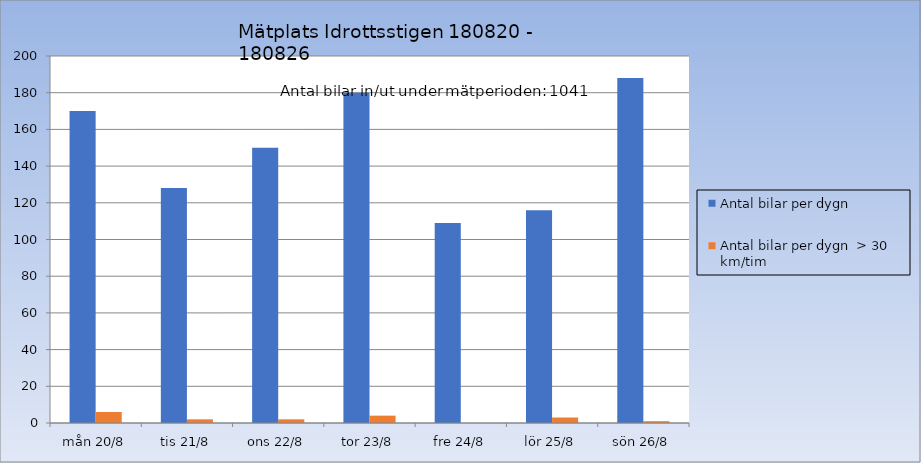
| Category | Antal bilar per dygn | Antal bilar per dygn  > 30 km/tim |
|---|---|---|
| mån 20/8 | 170 | 6 |
| tis 21/8 | 128 | 2 |
| ons 22/8 | 150 | 2 |
| tor 23/8 | 180 | 4 |
| fre 24/8 | 109 | 0 |
| lör 25/8 | 116 | 3 |
| sön 26/8 | 188 | 1 |